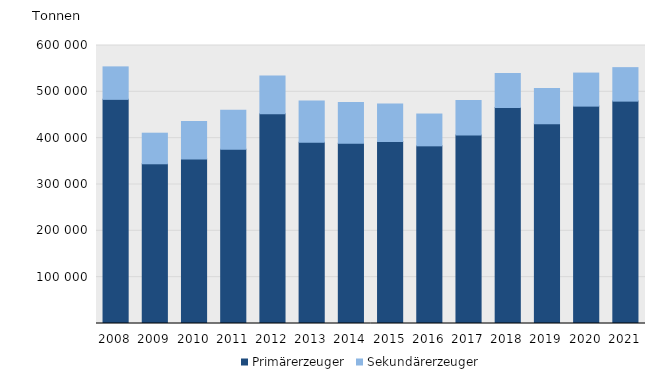
| Category | Primärerzeuger | Sekundärerzeuger |
|---|---|---|
| 2008.0 | 483769 | 70082 |
| 2009.0 | 344705 | 66025 |
| 2010.0 | 355164 | 80819 |
| 2011.0 | 375939 | 84429 |
| 2012.0 | 452834 | 81477 |
| 2013.0 | 391388 | 88807 |
| 2014.0 | 388854 | 88193 |
| 2015.0 | 392871 | 80689 |
| 2016.0 | 383445 | 68653 |
| 2017.0 | 407030 | 74519 |
| 2018.0 | 466122 | 73543 |
| 2019.0 | 431249 | 75688 |
| 2020.0 | 469172 | 71318 |
| 2021.0 | 479947 | 72258 |